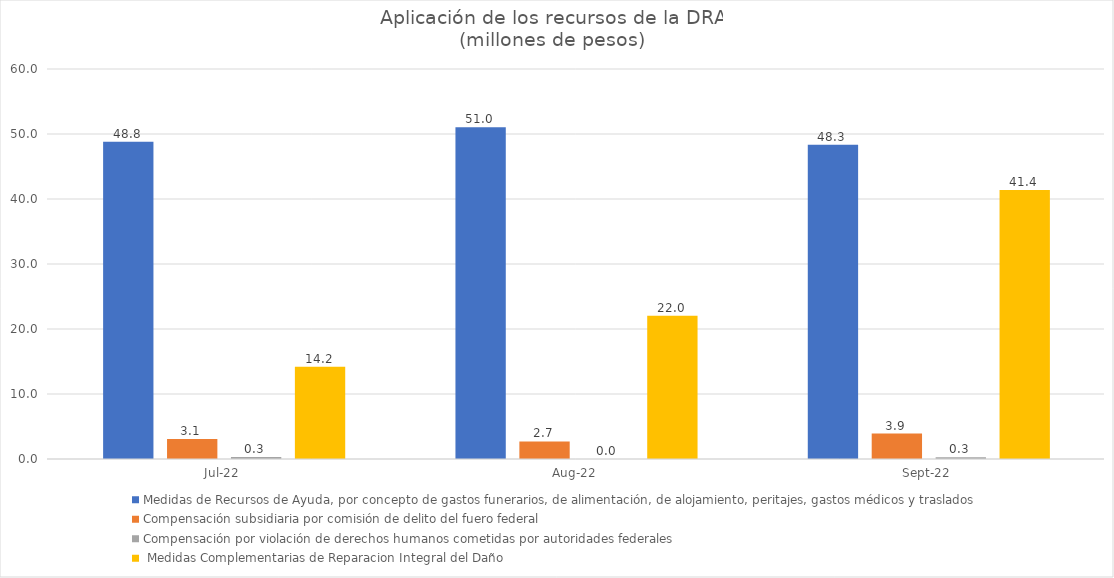
| Category | Medidas de Recursos de Ayuda, por concepto de gastos funerarios, de alimentación, de alojamiento, peritajes, gastos médicos y traslados | Compensación subsidiaria por comisión de delito del fuero federal | Compensación por violación de derechos humanos cometidas por autoridades federales |  Medidas Complementarias de Reparacion Integral del Daño |
|---|---|---|---|---|
| 2022-07-01 | 48.812 | 3.063 | 0.305 | 14.195 |
| 2022-08-01 | 51.037 | 2.708 | 0 | 22.032 |
| 2022-09-01 | 48.347 | 3.917 | 0.265 | 41.39 |